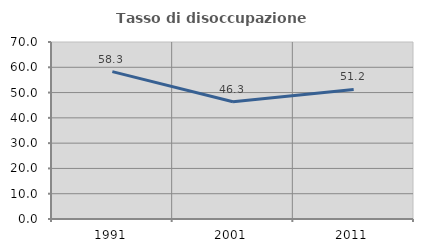
| Category | Tasso di disoccupazione giovanile  |
|---|---|
| 1991.0 | 58.268 |
| 2001.0 | 46.341 |
| 2011.0 | 51.22 |